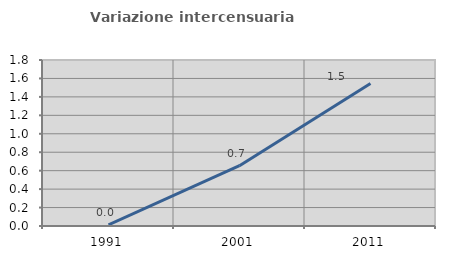
| Category | Variazione intercensuaria annua |
|---|---|
| 1991.0 | 0.013 |
| 2001.0 | 0.654 |
| 2011.0 | 1.545 |